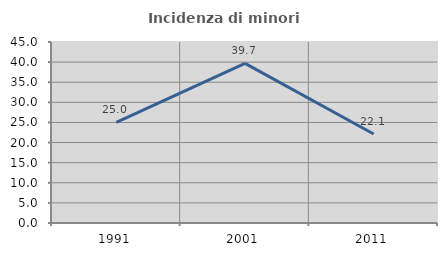
| Category | Incidenza di minori stranieri |
|---|---|
| 1991.0 | 25 |
| 2001.0 | 39.683 |
| 2011.0 | 22.131 |